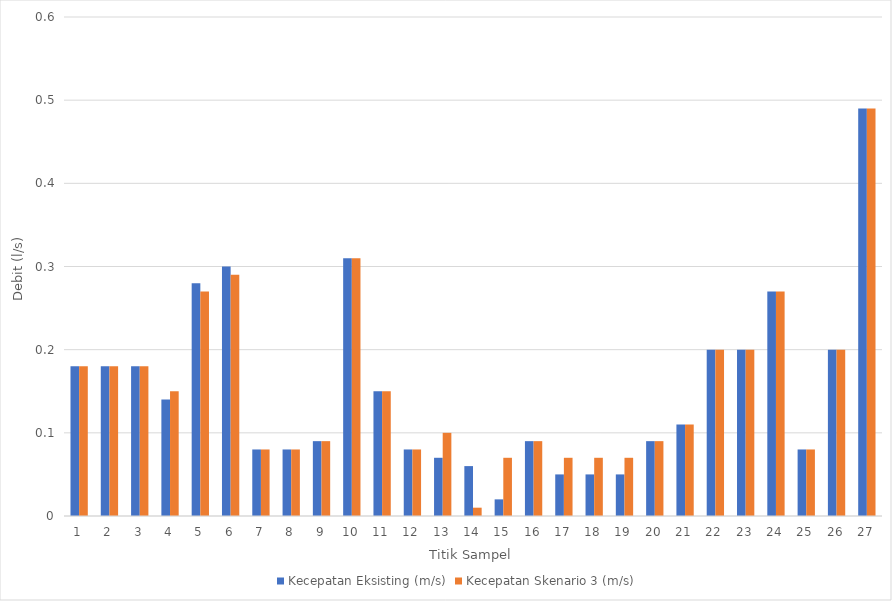
| Category | Kecepatan Eksisting (m/s) | Kecepatan Skenario 3 (m/s) |
|---|---|---|
| 0 | 0.18 | 0.18 |
| 1 | 0.18 | 0.18 |
| 2 | 0.18 | 0.18 |
| 3 | 0.14 | 0.15 |
| 4 | 0.28 | 0.27 |
| 5 | 0.3 | 0.29 |
| 6 | 0.08 | 0.08 |
| 7 | 0.08 | 0.08 |
| 8 | 0.09 | 0.09 |
| 9 | 0.31 | 0.31 |
| 10 | 0.15 | 0.15 |
| 11 | 0.08 | 0.08 |
| 12 | 0.07 | 0.1 |
| 13 | 0.06 | 0.01 |
| 14 | 0.02 | 0.07 |
| 15 | 0.09 | 0.09 |
| 16 | 0.05 | 0.07 |
| 17 | 0.05 | 0.07 |
| 18 | 0.05 | 0.07 |
| 19 | 0.09 | 0.09 |
| 20 | 0.11 | 0.11 |
| 21 | 0.2 | 0.2 |
| 22 | 0.2 | 0.2 |
| 23 | 0.27 | 0.27 |
| 24 | 0.08 | 0.08 |
| 25 | 0.2 | 0.2 |
| 26 | 0.49 | 0.49 |